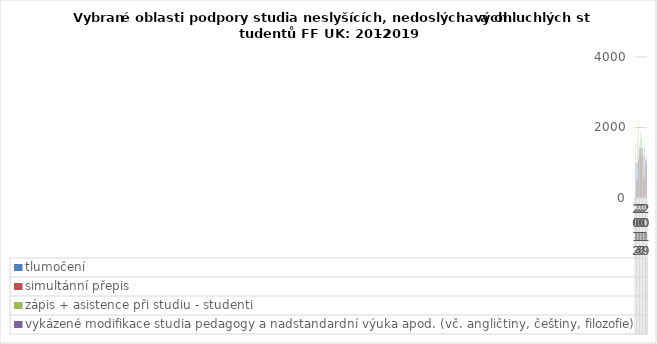
| Category | tlumočení | simultánní přepis | zápis + asistence při studiu - studenti | vykázené modifikace studia pedagogy a nadstandardní výuka apod. (vč. angličtiny, češtiny, filozofie) |
|---|---|---|---|---|
| 2012.0 | 1000 | 150 | 1550 | 550 |
| 2013.0 | 1000 | 500 | 1700 | 1000 |
| 2014.0 | 1170 | 1100 | 2200 | 1480 |
| 2015.0 | 1370 | 1400 | 1890 | 1430 |
| 2016.0 | 1700 | 1200 | 1670 | 1440 |
| 2017.0 | 1400 | 550 | 1280 | 1190 |
| 2018.0 | 1500 | 600 | 840 | 1130 |
| 2019.0 | 1100 | 990 | 1030 | 1240 |